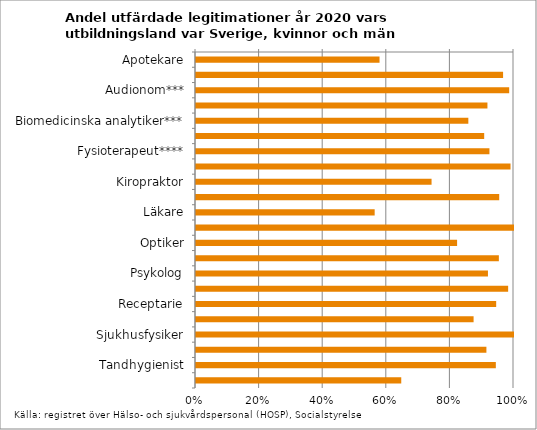
| Category | Series 0 |
|---|---|
| Apotekare | 0.577 |
| Arbetsterapeut | 0.966 |
| Audionom*** | 0.985 |
| Barnmorska | 0.916 |
| Biomedicinska analytiker*** | 0.856 |
| Dietist*** | 0.906 |
| Fysioterapeut**** | 0.923 |
| Hälso- och sjukvårdskurator*** | 0.989 |
| Kiropraktor | 0.741 |
| Logoped | 0.953 |
| Läkare | 0.562 |
| Naprapat | 1 |
| Optiker | 0.821 |
| Ortopedingenjör*** | 0.952 |
| Psykolog | 0.918 |
| Psykoterapeut | 0.982 |
| Receptarie | 0.944 |
| Röntgensjuksköterska*** | 0.873 |
| Sjukhusfysiker | 1 |
| Sjuksköterska | 0.913 |
| Tandhygienist | 0.943 |
| Tandläkare | 0.645 |